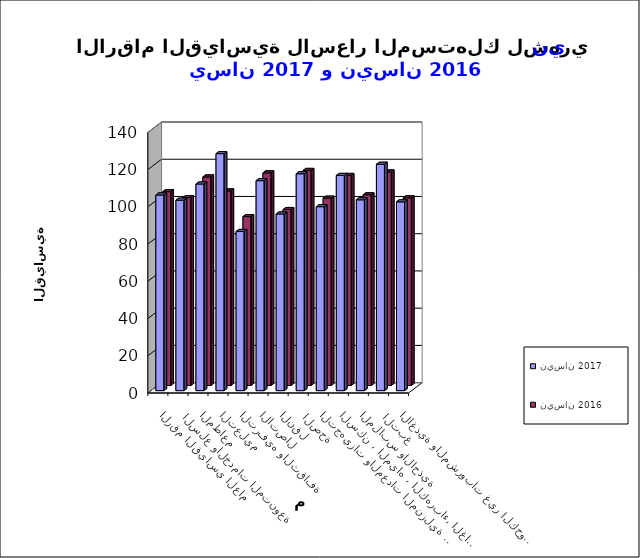
| Category | نيسان 2017      | نيسان 2016 |
|---|---|---|
| الاغذية والمشروبات غير الكحولية | 101.4 | 100.8 |
|  التبغ | 121.6 | 114.7 |
| الملابس والاحذية | 102.5 | 102.4 |
| السكن ، المياه ، الكهرباء، الغاز  | 115.6 | 112.8 |
| التجهيزات والمعدات المنزلية والصيانة | 98.8 | 100.6 |
|  الصحة | 116.5 | 115.5 |
| النقل | 94.9 | 94.5 |
| الاتصال | 112.8 | 114.2 |
| الترفيه والثقافة | 85.5 | 90.7 |
| التعليم | 127.3 | 104.5 |
| المطاعم  | 111 | 112 |
|  السلع والخدمات المتنوعة | 102.3 | 100.9 |
| الرقم القياسي العام | 105.1 | 104.1 |